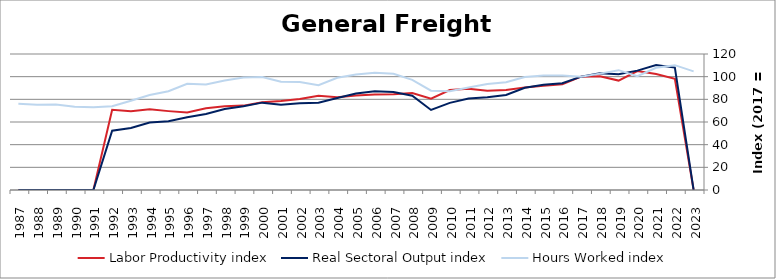
| Category | Labor Productivity index | Real Sectoral Output index | Hours Worked index |
|---|---|---|---|
| 2023.0 | 0 | 0 | 104.642 |
| 2022.0 | 98.036 | 107.979 | 110.141 |
| 2021.0 | 102.266 | 110.32 | 107.876 |
| 2020.0 | 104.893 | 105.327 | 100.414 |
| 2019.0 | 96.535 | 102.08 | 105.743 |
| 2018.0 | 100.268 | 102.965 | 102.69 |
| 2017.0 | 100 | 100 | 100 |
| 2016.0 | 93.25 | 94.166 | 100.982 |
| 2015.0 | 91.931 | 92.832 | 100.98 |
| 2014.0 | 90.454 | 90.154 | 99.669 |
| 2013.0 | 88.217 | 83.867 | 95.068 |
| 2012.0 | 87.55 | 81.93 | 93.582 |
| 2011.0 | 89.42 | 80.801 | 90.361 |
| 2010.0 | 88.165 | 76.877 | 87.197 |
| 2009.0 | 80.565 | 70.601 | 87.633 |
| 2008.0 | 85.597 | 83.19 | 97.188 |
| 2007.0 | 84.389 | 86.479 | 102.477 |
| 2006.0 | 84.2 | 87.151 | 103.505 |
| 2005.0 | 83.422 | 85.087 | 101.996 |
| 2004.0 | 81.895 | 81.147 | 99.087 |
| 2003.0 | 83.224 | 76.988 | 92.507 |
| 2002.0 | 80.366 | 76.534 | 95.232 |
| 2001.0 | 78.6 | 75.123 | 95.576 |
| 2000.0 | 77.332 | 77.083 | 99.678 |
| 1999.0 | 74.455 | 73.926 | 99.29 |
| 1998.0 | 73.838 | 71.405 | 96.705 |
| 1997.0 | 72.076 | 67.122 | 93.126 |
| 1996.0 | 68.385 | 64.13 | 93.778 |
| 1995.0 | 69.595 | 60.648 | 87.145 |
| 1994.0 | 71.149 | 59.617 | 83.792 |
| 1993.0 | 69.564 | 54.768 | 78.731 |
| 1992.0 | 70.784 | 52.322 | 73.918 |
| 1991.0 | 0 | 0 | 72.968 |
| 1990.0 | 0 | 0 | 73.391 |
| 1989.0 | 0 | 0 | 75.363 |
| 1988.0 | 0 | 0 | 75.325 |
| 1987.0 | 0 | 0 | 76.001 |